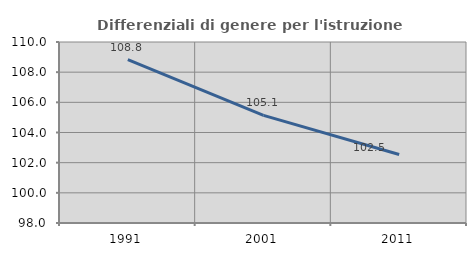
| Category | Differenziali di genere per l'istruzione superiore |
|---|---|
| 1991.0 | 108.833 |
| 2001.0 | 105.132 |
| 2011.0 | 102.543 |